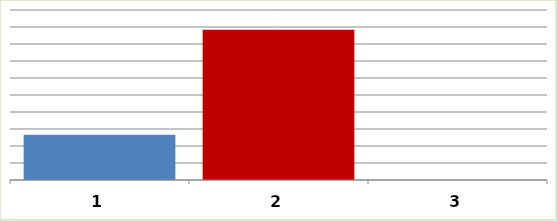
| Category | Series 0 |
|---|---|
| 0 | 26588113 |
| 1 | 88309259 |
| 2 | 0 |